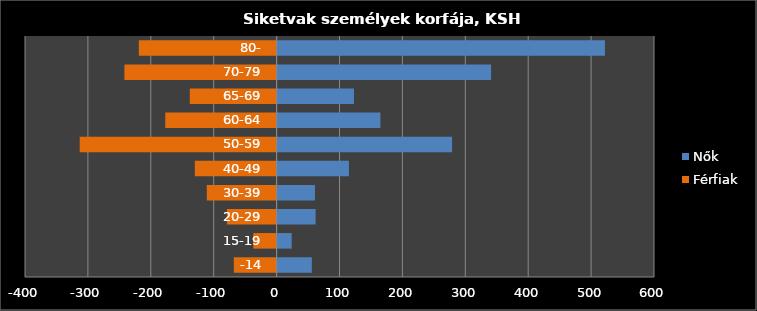
| Category | Nők | Férfiak |
|---|---|---|
| -14 | 56 | -68 |
| 15-19 | 24 | -37 |
| 20-29 | 62 | -79 |
| 30-39 | 61 | -111 |
| 40-49 | 115 | -130 |
| 50-59 | 279 | -313 |
| 60-64 | 165 | -177 |
| 65-69 | 123 | -138 |
| 70-79 | 341 | -242 |
| 80- | 522 | -219 |